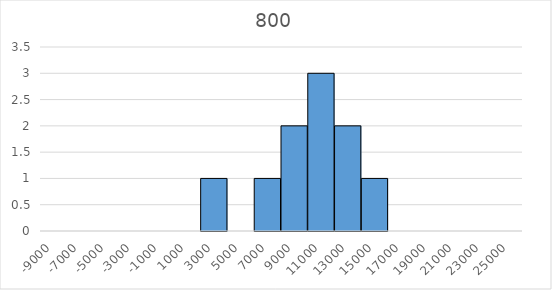
| Category | Series 0 | Series 1 |
|---|---|---|
| -9000.0 | 0 | 0 |
| -7000.0 | 0 | 0 |
| -5000.0 | 0 | 0 |
| -3000.0 | 0 | 0 |
| -1000.0 | 0 | 0 |
| 1000.0 | 0 | 0 |
| 3000.0 | 0 | 1 |
| 5000.0 | 0 | 0 |
| 7000.0 | 0 | 1 |
| 9000.0 | 0 | 2 |
| 11000.0 | 0 | 3 |
| 13000.0 | 0 | 2 |
| 15000.0 | 0 | 1 |
| 17000.0 | 0 | 0 |
| 19000.0 | 0 | 0 |
| 21000.0 | 0 | 0 |
| 23000.0 | 0 | 0 |
| 25000.0 | 0 | 0 |